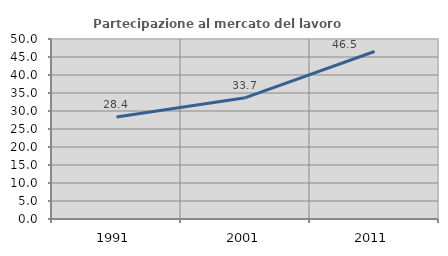
| Category | Partecipazione al mercato del lavoro  femminile |
|---|---|
| 1991.0 | 28.358 |
| 2001.0 | 33.704 |
| 2011.0 | 46.519 |